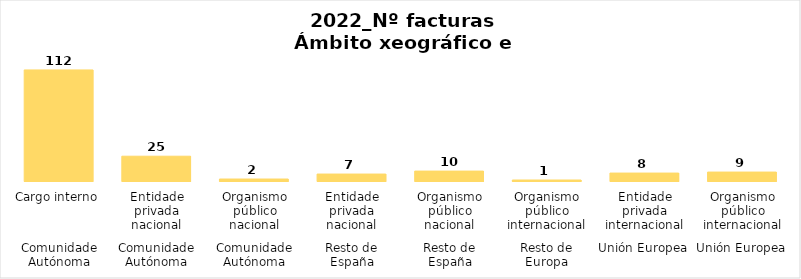
| Category | Series 0 |
|---|---|
| 0 | 112 |
| 1 | 25 |
| 2 | 2 |
| 3 | 7 |
| 4 | 10 |
| 5 | 1 |
| 6 | 8 |
| 7 | 9 |